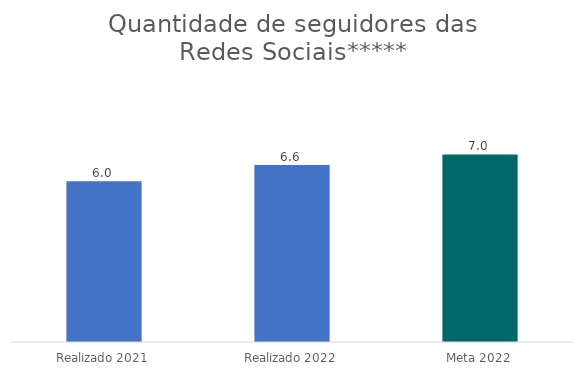
| Category | Series 0 |
|---|---|
| Realizado 2021 | 6 |
| Realizado 2022 | 6.6 |
| Meta 2022 | 7 |